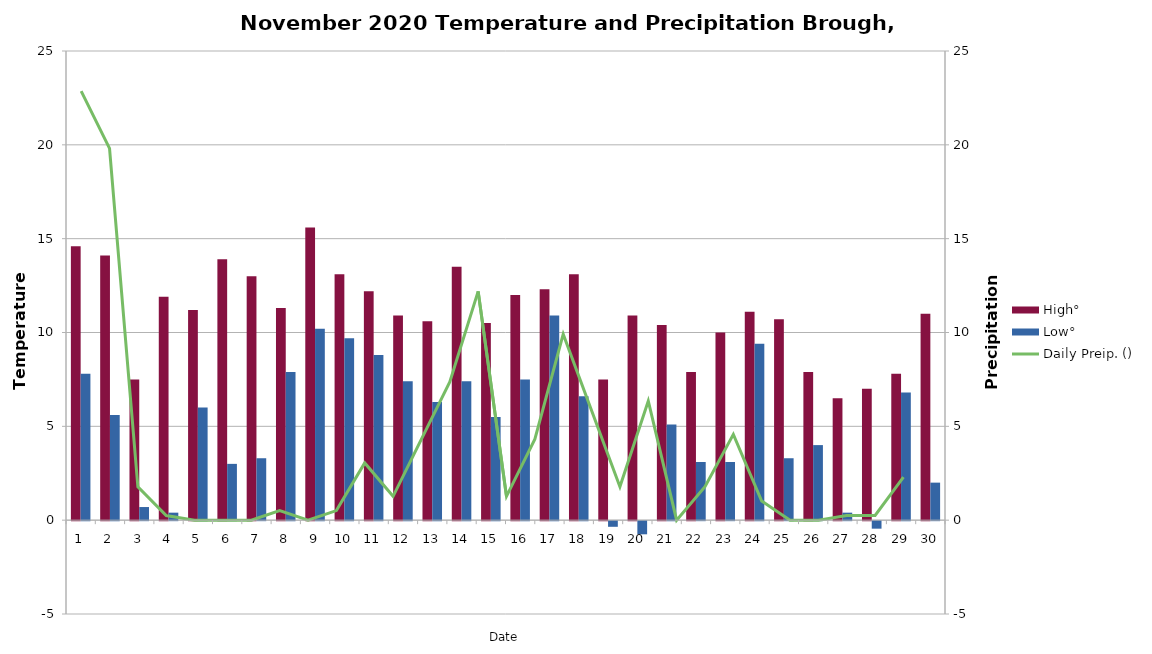
| Category | High° | Low° |
|---|---|---|
| 0 | 14.6 | 7.8 |
| 1 | 14.1 | 5.6 |
| 2 | 7.5 | 0.7 |
| 3 | 11.9 | 0.4 |
| 4 | 11.2 | 6 |
| 5 | 13.9 | 3 |
| 6 | 13 | 3.3 |
| 7 | 11.3 | 7.9 |
| 8 | 15.6 | 10.2 |
| 9 | 13.1 | 9.7 |
| 10 | 12.2 | 8.8 |
| 11 | 10.9 | 7.4 |
| 12 | 10.6 | 6.3 |
| 13 | 13.5 | 7.4 |
| 14 | 10.5 | 5.5 |
| 15 | 12 | 7.5 |
| 16 | 12.3 | 10.9 |
| 17 | 13.1 | 6.6 |
| 18 | 7.5 | -0.3 |
| 19 | 10.9 | -0.7 |
| 20 | 10.4 | 5.1 |
| 21 | 7.9 | 3.1 |
| 22 | 10 | 3.1 |
| 23 | 11.1 | 9.4 |
| 24 | 10.7 | 3.3 |
| 25 | 7.9 | 4 |
| 26 | 6.5 | 0.4 |
| 27 | 7 | -0.4 |
| 28 | 7.8 | 6.8 |
| 29 | 11 | 2 |